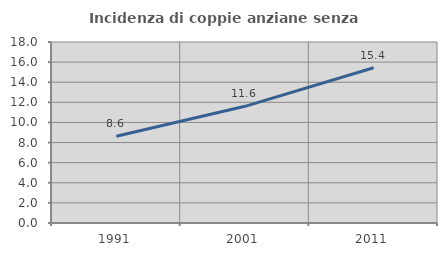
| Category | Incidenza di coppie anziane senza figli  |
|---|---|
| 1991.0 | 8.63 |
| 2001.0 | 11.602 |
| 2011.0 | 15.444 |